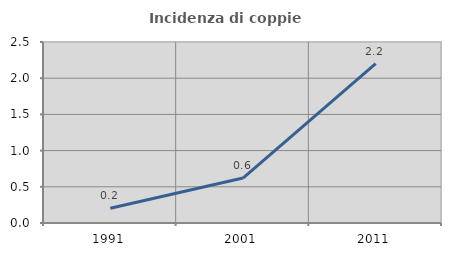
| Category | Incidenza di coppie miste |
|---|---|
| 1991.0 | 0.204 |
| 2001.0 | 0.621 |
| 2011.0 | 2.202 |